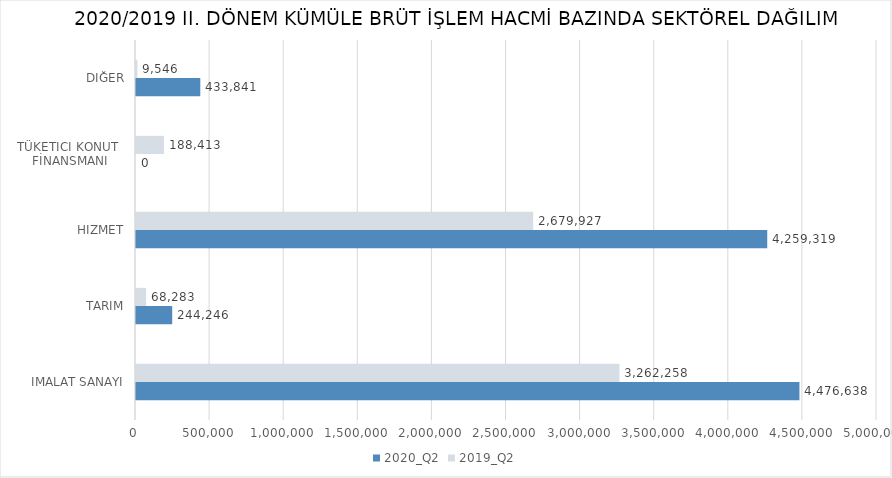
| Category | 2020_Q2 | 2019_Q2 |
|---|---|---|
| İMALAT SANAYİ | 4476638.024 | 3262257.939 |
| TARIM | 244245.607 | 68283.285 |
| HİZMET | 4259319.308 | 2679926.714 |
| TÜKETİCİ KONUT 
FİNANSMANI | 0 | 188413 |
| DİĞER | 433841.38 | 9545.75 |